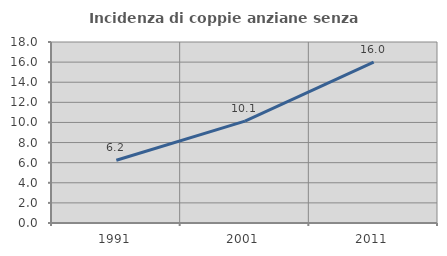
| Category | Incidenza di coppie anziane senza figli  |
|---|---|
| 1991.0 | 6.237 |
| 2001.0 | 10.134 |
| 2011.0 | 16 |